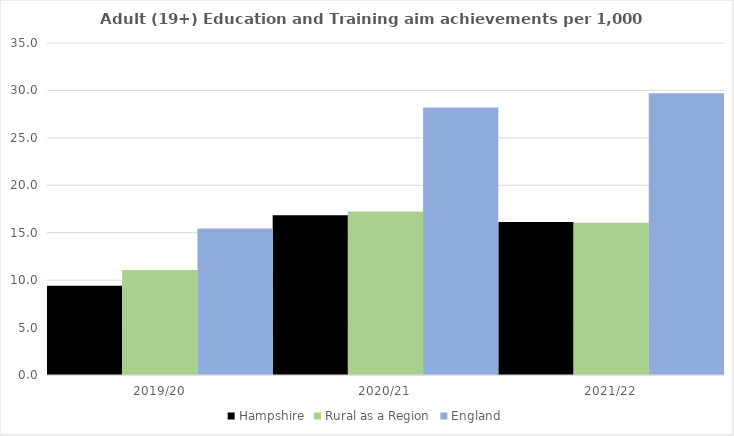
| Category | Hampshire | Rural as a Region | England |
|---|---|---|---|
| 2019/20 | 9.419 | 11.081 | 15.446 |
| 2020/21 | 16.852 | 17.224 | 28.211 |
| 2021/22 | 16.133 | 16.063 | 29.711 |